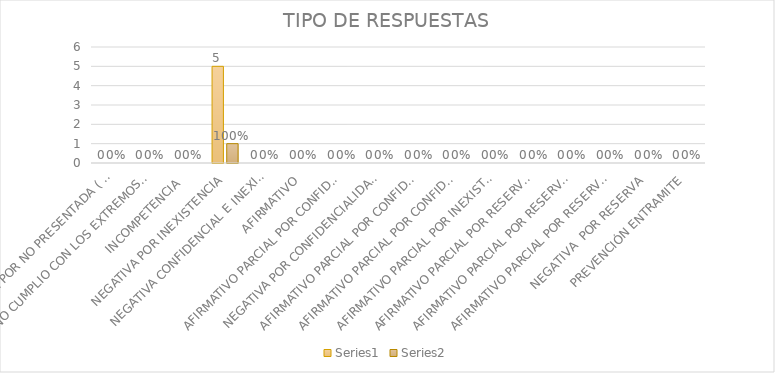
| Category | Series 4 | Series 5 |
|---|---|---|
| SE TIENE POR NO PRESENTADA ( NO CUMPLIÓ PREVENCIÓN) | 0 | 0 |
| NO CUMPLIO CON LOS EXTREMOS DEL ARTÍCULO 79 (REQUISITOS) | 0 | 0 |
| INCOMPETENCIA  | 0 | 0 |
| NEGATIVA POR INEXISTENCIA | 5 | 1 |
| NEGATIVA CONFIDENCIAL E INEXISTENTE | 0 | 0 |
| AFIRMATIVO | 0 | 0 |
| AFIRMATIVO PARCIAL POR CONFIDENCIALIDAD  | 0 | 0 |
| NEGATIVA POR CONFIDENCIALIDAD Y RESERVADA | 0 | 0 |
| AFIRMATIVO PARCIAL POR CONFIDENCIALIDAD E INEXISTENCIA | 0 | 0 |
| AFIRMATIVO PARCIAL POR CONFIDENCIALIDAD, RESERVA E INEXISTENCIA | 0 | 0 |
| AFIRMATIVO PARCIAL POR INEXISTENCIA | 0 | 0 |
| AFIRMATIVO PARCIAL POR RESERVA | 0 | 0 |
| AFIRMATIVO PARCIAL POR RESERVA Y CONFIDENCIALIDAD | 0 | 0 |
| AFIRMATIVO PARCIAL POR RESERVA E INEXISTENCIA | 0 | 0 |
| NEGATIVA  POR RESERVA | 0 | 0 |
| PREVENCIÓN ENTRAMITE | 0 | 0 |